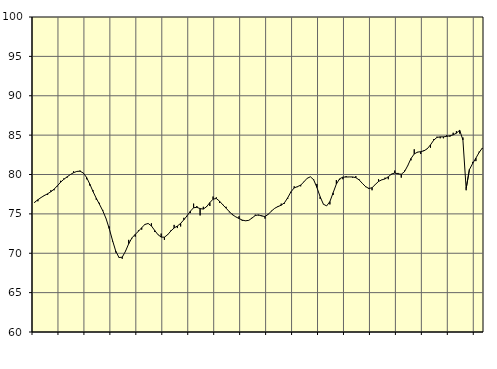
| Category | Piggar | Samtliga sysselsatta (inkl. sysselsatta utomlands)1 |
|---|---|---|
| nan | 76.4 | 76.48 |
| 87.0 | 76.6 | 76.79 |
| 87.0 | 77.1 | 77.08 |
| 87.0 | 77.4 | 77.33 |
| nan | 77.4 | 77.55 |
| 88.0 | 78 | 77.81 |
| 88.0 | 78 | 78.14 |
| 88.0 | 78.5 | 78.56 |
| nan | 79.2 | 79.02 |
| 89.0 | 79.5 | 79.39 |
| 89.0 | 79.6 | 79.7 |
| 89.0 | 80 | 79.99 |
| nan | 80.4 | 80.23 |
| 90.0 | 80.4 | 80.39 |
| 90.0 | 80.5 | 80.42 |
| 90.0 | 80.2 | 80.19 |
| nan | 79.4 | 79.64 |
| 91.0 | 78.6 | 78.79 |
| 91.0 | 78 | 77.84 |
| 91.0 | 76.8 | 76.98 |
| nan | 76.4 | 76.21 |
| 92.0 | 75.5 | 75.4 |
| 92.0 | 74.4 | 74.42 |
| 92.0 | 73.4 | 73.13 |
| nan | 71.5 | 71.64 |
| 93.0 | 70.1 | 70.27 |
| 93.0 | 69.5 | 69.46 |
| 93.0 | 69.3 | 69.5 |
| nan | 70.3 | 70.25 |
| 94.0 | 71.7 | 71.21 |
| 94.0 | 71.9 | 71.95 |
| 94.0 | 72.1 | 72.4 |
| nan | 72.9 | 72.79 |
| 95.0 | 73 | 73.25 |
| 95.0 | 73.7 | 73.66 |
| 95.0 | 73.8 | 73.78 |
| nan | 73.8 | 73.47 |
| 96.0 | 72.7 | 72.9 |
| 96.0 | 72.4 | 72.37 |
| 96.0 | 72.5 | 72.05 |
| nan | 71.7 | 72.04 |
| 97.0 | 72.4 | 72.35 |
| 97.0 | 72.9 | 72.83 |
| 97.0 | 73.6 | 73.21 |
| nan | 73.2 | 73.46 |
| 98.0 | 73.4 | 73.79 |
| 98.0 | 74.5 | 74.25 |
| 98.0 | 74.7 | 74.76 |
| nan | 75.1 | 75.34 |
| 99.0 | 76.3 | 75.78 |
| 99.0 | 76 | 75.83 |
| 99.0 | 74.8 | 75.67 |
| nan | 75.9 | 75.61 |
| 0.0 | 76 | 75.91 |
| 0.0 | 76 | 76.43 |
| 0.0 | 77.2 | 76.87 |
| nan | 77.1 | 76.95 |
| 1.0 | 76.4 | 76.61 |
| 1.0 | 76.2 | 76.15 |
| 1.0 | 75.9 | 75.73 |
| nan | 75.2 | 75.28 |
| 2.0 | 75 | 74.89 |
| 2.0 | 74.6 | 74.62 |
| 2.0 | 74.7 | 74.41 |
| nan | 74.1 | 74.21 |
| 3.0 | 74.1 | 74.12 |
| 3.0 | 74.2 | 74.18 |
| 3.0 | 74.5 | 74.47 |
| nan | 74.9 | 74.79 |
| 4.0 | 74.8 | 74.87 |
| 4.0 | 74.8 | 74.73 |
| 4.0 | 74.4 | 74.67 |
| nan | 75 | 74.94 |
| 5.0 | 75.4 | 75.36 |
| 5.0 | 75.7 | 75.71 |
| 5.0 | 76 | 75.93 |
| nan | 76.3 | 76.1 |
| 6.0 | 76.3 | 76.41 |
| 6.0 | 76.9 | 77.04 |
| 6.0 | 77.7 | 77.8 |
| nan | 78.5 | 78.3 |
| 7.0 | 78.4 | 78.46 |
| 7.0 | 78.5 | 78.65 |
| 7.0 | 79.1 | 79.07 |
| nan | 79.5 | 79.52 |
| 8.0 | 79.7 | 79.71 |
| 8.0 | 79.4 | 79.33 |
| 8.0 | 78.8 | 78.36 |
| nan | 76.9 | 77.17 |
| 9.0 | 76.2 | 76.23 |
| 9.0 | 76 | 76.01 |
| 9.0 | 76.2 | 76.56 |
| nan | 77.4 | 77.68 |
| 10.0 | 79.3 | 78.79 |
| 10.0 | 79.3 | 79.45 |
| 10.0 | 79.4 | 79.67 |
| nan | 79.8 | 79.68 |
| 11.0 | 79.7 | 79.69 |
| 11.0 | 79.6 | 79.69 |
| 11.0 | 79.8 | 79.6 |
| nan | 79.4 | 79.32 |
| 12.0 | 78.9 | 78.88 |
| 12.0 | 78.4 | 78.47 |
| 12.0 | 78.3 | 78.22 |
| nan | 78 | 78.32 |
| 13.0 | 78.7 | 78.73 |
| 13.0 | 79.4 | 79.12 |
| 13.0 | 79.3 | 79.32 |
| nan | 79.6 | 79.44 |
| 14.0 | 79.4 | 79.71 |
| 14.0 | 80 | 80.06 |
| 14.0 | 80.5 | 80.19 |
| nan | 80.2 | 80.09 |
| 15.0 | 79.6 | 80.03 |
| 15.0 | 80.5 | 80.36 |
| 15.0 | 81.1 | 81.13 |
| nan | 81.8 | 82.03 |
| 16.0 | 83.2 | 82.61 |
| 16.0 | 82.8 | 82.84 |
| 16.0 | 82.6 | 82.9 |
| nan | 83.1 | 83.01 |
| 17.0 | 83.3 | 83.26 |
| 17.0 | 83.4 | 83.76 |
| 17.0 | 84.5 | 84.36 |
| nan | 84.8 | 84.71 |
| 18.0 | 84.6 | 84.78 |
| 18.0 | 84.6 | 84.78 |
| 18.0 | 85 | 84.84 |
| nan | 84.8 | 84.92 |
| 19.0 | 85.3 | 85.03 |
| 19.0 | 85.5 | 85.25 |
| 19.0 | 85.2 | 85.62 |
| nan | 84.7 | 84.39 |
| 20.0 | 78 | 78.21 |
| 20.0 | 80.7 | 80.62 |
| 20.0 | 81.6 | 81.4 |
| nan | 81.7 | 82.08 |
| 21.0 | 82.9 | 82.8 |
| 21.0 | 83.3 | 83.37 |